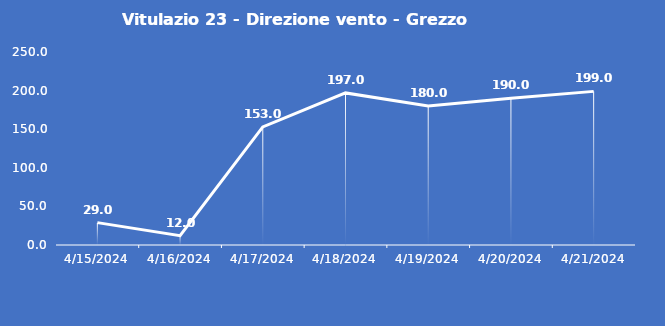
| Category | Vitulazio 23 - Direzione vento - Grezzo (°N) |
|---|---|
| 4/15/24 | 29 |
| 4/16/24 | 12 |
| 4/17/24 | 153 |
| 4/18/24 | 197 |
| 4/19/24 | 180 |
| 4/20/24 | 190 |
| 4/21/24 | 199 |